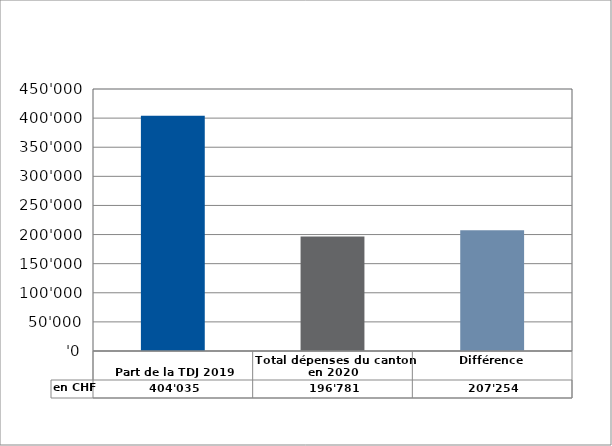
| Category | en CHF |
|---|---|
| 
Part de la TDJ 2019

 | 404035 |
| Total dépenses du canton en 2020 | 196781.2 |
| Différence | 207253.8 |